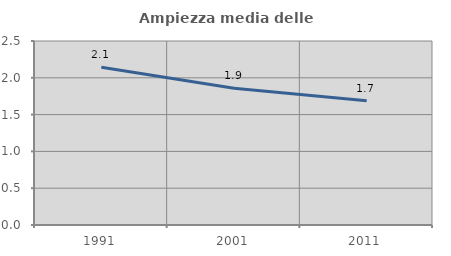
| Category | Ampiezza media delle famiglie |
|---|---|
| 1991.0 | 2.145 |
| 2001.0 | 1.858 |
| 2011.0 | 1.687 |